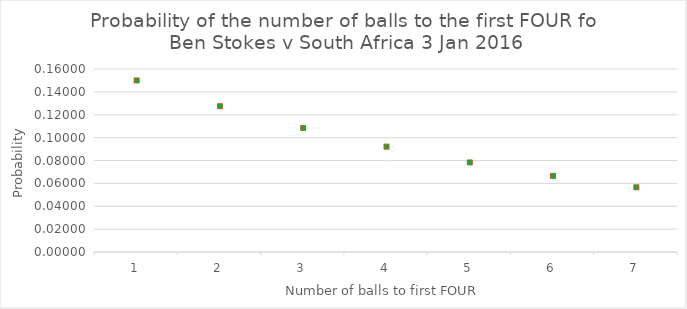
| Category | Probability |
|---|---|
| 1.0 | 0.15 |
| 2.0 | 0.128 |
| 3.0 | 0.108 |
| 4.0 | 0.092 |
| 5.0 | 0.078 |
| 6.0 | 0.067 |
| 7.0 | 0.057 |